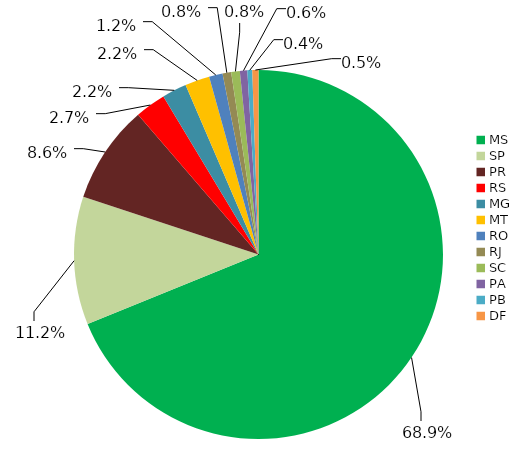
| Category | Series 0 |
|---|---|
| MS | 0.674 |
| SP | 0.11 |
| PR | 0.084 |
| RS | 0.026 |
| MG | 0.021 |
| MT | 0.021 |
| RO | 0.012 |
| RJ | 0.007 |
| SC | 0.007 |
| PA | 0.006 |
| PB | 0.004 |
| DF | 0.005 |